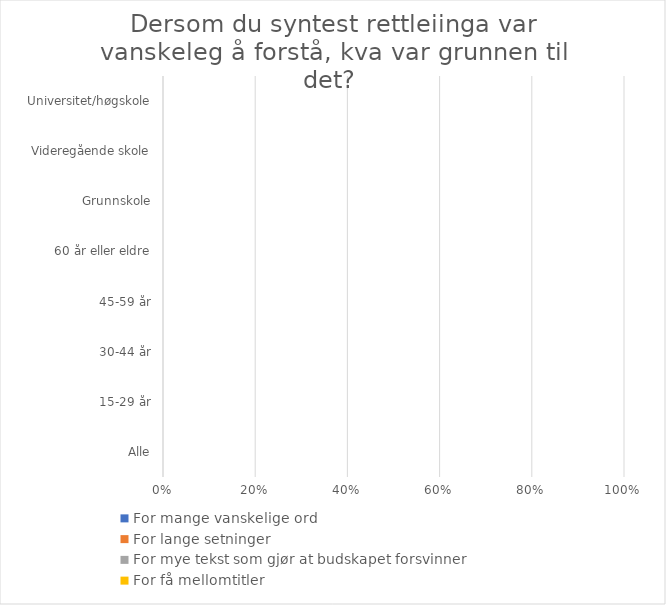
| Category | For mange vanskelige ord | For lange setninger | For mye tekst som gjør at budskapet forsvinner | For få mellomtitler |
|---|---|---|---|---|
| Alle | 0 | 0 | 0 | 0 |
| 15-29 år | 0 | 0 | 0 | 0 |
| 30-44 år | 0 | 0 | 0 | 0 |
| 45-59 år | 0 | 0 | 0 | 0 |
| 60 år eller eldre | 0 | 0 | 0 | 0 |
| Grunnskole | 0 | 0 | 0 | 0 |
| Videregående skole | 0 | 0 | 0 | 0 |
| Universitet/høgskole | 0 | 0 | 0 | 0 |